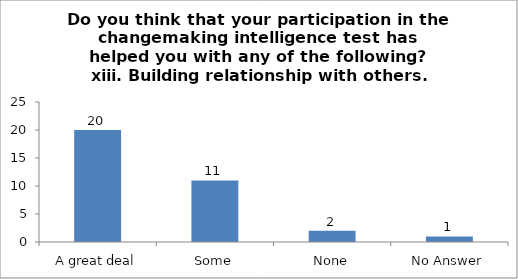
| Category | Do you think that your participation in the changemaking intelligence test has helped you with any of the following?
 xiii. Building relationship with others. |
|---|---|
| A great deal | 20 |
| Some | 11 |
| None | 2 |
| No Answer | 1 |